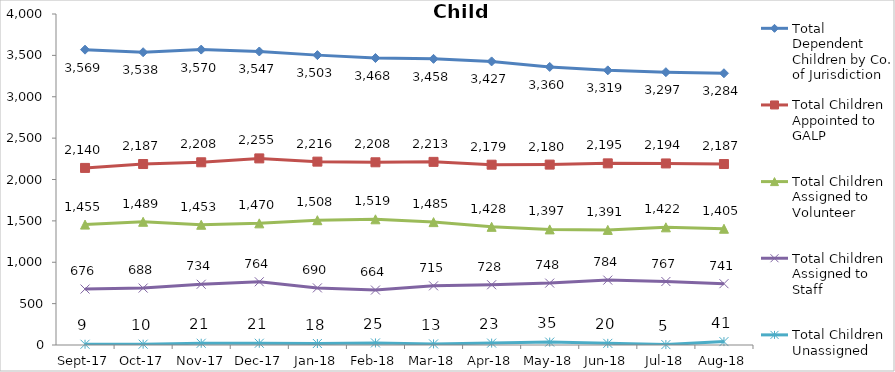
| Category | Total Dependent Children by Co. of Jurisdiction | Total Children Appointed to GALP | Total Children Assigned to Volunteer | Total Children Assigned to Staff | Total Children Unassigned |
|---|---|---|---|---|---|
| 2017-09-01 | 3569 | 2140 | 1455 | 676 | 9 |
| 2017-10-01 | 3538 | 2187 | 1489 | 688 | 10 |
| 2017-11-01 | 3570 | 2208 | 1453 | 734 | 21 |
| 2017-12-01 | 3547 | 2255 | 1470 | 764 | 21 |
| 2018-01-01 | 3503 | 2216 | 1508 | 690 | 18 |
| 2018-02-01 | 3468 | 2208 | 1519 | 664 | 25 |
| 2018-03-01 | 3458 | 2213 | 1485 | 715 | 13 |
| 2018-04-01 | 3427 | 2179 | 1428 | 728 | 23 |
| 2018-05-01 | 3360 | 2180 | 1397 | 748 | 35 |
| 2018-06-01 | 3319 | 2195 | 1391 | 784 | 20 |
| 2018-07-01 | 3297 | 2194 | 1422 | 767 | 5 |
| 2018-08-01 | 3284 | 2187 | 1405 | 741 | 41 |